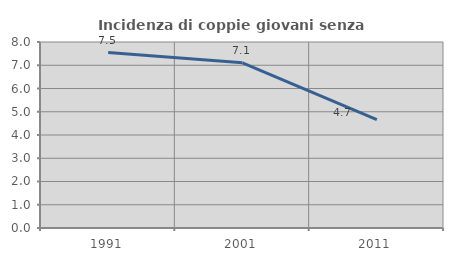
| Category | Incidenza di coppie giovani senza figli |
|---|---|
| 1991.0 | 7.548 |
| 2001.0 | 7.104 |
| 2011.0 | 4.663 |